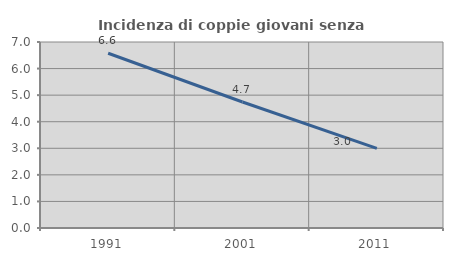
| Category | Incidenza di coppie giovani senza figli |
|---|---|
| 1991.0 | 6.576 |
| 2001.0 | 4.741 |
| 2011.0 | 2.998 |